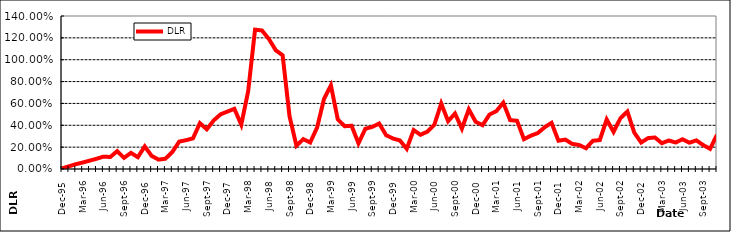
| Category | DLR |
|---|---|
| 1995-12-01 | 0.006 |
| 1996-01-01 | 0.025 |
| 1996-02-01 | 0.044 |
| 1996-03-01 | 0.059 |
| 1996-04-01 | 0.076 |
| 1996-05-01 | 0.093 |
| 1996-06-01 | 0.113 |
| 1996-07-01 | 0.11 |
| 1996-08-01 | 0.163 |
| 1996-09-01 | 0.102 |
| 1996-10-01 | 0.147 |
| 1996-11-01 | 0.108 |
| 1996-12-01 | 0.206 |
| 1997-01-01 | 0.12 |
| 1997-02-01 | 0.086 |
| 1997-03-01 | 0.094 |
| 1997-04-01 | 0.155 |
| 1997-05-01 | 0.251 |
| 1997-06-01 | 0.264 |
| 1997-07-01 | 0.281 |
| 1997-08-01 | 0.42 |
| 1997-09-01 | 0.363 |
| 1997-10-01 | 0.444 |
| 1997-11-01 | 0.5 |
| 1997-12-01 | 0.526 |
| 1998-01-01 | 0.551 |
| 1998-02-01 | 0.406 |
| 1998-03-01 | 0.711 |
| 1998-04-01 | 1.276 |
| 1998-05-01 | 1.268 |
| 1998-06-01 | 1.19 |
| 1998-07-01 | 1.087 |
| 1998-08-01 | 1.041 |
| 1998-09-01 | 0.483 |
| 1998-10-01 | 0.214 |
| 1998-11-01 | 0.273 |
| 1998-12-01 | 0.243 |
| 1999-01-01 | 0.38 |
| 1999-02-01 | 0.641 |
| 1999-03-01 | 0.765 |
| 1999-04-01 | 0.454 |
| 1999-05-01 | 0.391 |
| 1999-06-01 | 0.396 |
| 1999-07-01 | 0.235 |
| 1999-08-01 | 0.368 |
| 1999-09-01 | 0.385 |
| 1999-10-01 | 0.416 |
| 1999-11-01 | 0.31 |
| 1999-12-01 | 0.279 |
| 2000-01-01 | 0.262 |
| 2000-02-01 | 0.185 |
| 2000-03-01 | 0.356 |
| 2000-04-01 | 0.313 |
| 2000-05-01 | 0.342 |
| 2000-06-01 | 0.404 |
| 2000-07-01 | 0.599 |
| 2000-08-01 | 0.438 |
| 2000-09-01 | 0.508 |
| 2000-10-01 | 0.369 |
| 2000-11-01 | 0.546 |
| 2000-12-01 | 0.432 |
| 2001-01-01 | 0.401 |
| 2001-02-01 | 0.498 |
| 2001-03-01 | 0.529 |
| 2001-04-01 | 0.606 |
| 2001-05-01 | 0.447 |
| 2001-06-01 | 0.441 |
| 2001-07-01 | 0.273 |
| 2001-08-01 | 0.305 |
| 2001-09-01 | 0.328 |
| 2001-10-01 | 0.382 |
| 2001-11-01 | 0.422 |
| 2001-12-01 | 0.259 |
| 2002-01-01 | 0.269 |
| 2002-02-01 | 0.23 |
| 2002-03-01 | 0.22 |
| 2002-04-01 | 0.19 |
| 2002-05-01 | 0.258 |
| 2002-06-01 | 0.265 |
| 2002-07-01 | 0.454 |
| 2002-08-01 | 0.339 |
| 2002-09-01 | 0.465 |
| 2002-10-01 | 0.526 |
| 2002-11-01 | 0.333 |
| 2002-12-01 | 0.242 |
| 2003-01-01 | 0.282 |
| 2003-02-01 | 0.289 |
| 2003-03-01 | 0.236 |
| 2003-04-01 | 0.261 |
| 2003-05-01 | 0.242 |
| 2003-06-01 | 0.272 |
| 2003-07-01 | 0.24 |
| 2003-08-01 | 0.262 |
| 2003-09-01 | 0.219 |
| 2003-10-01 | 0.184 |
| 2003-11-01 | 0.314 |